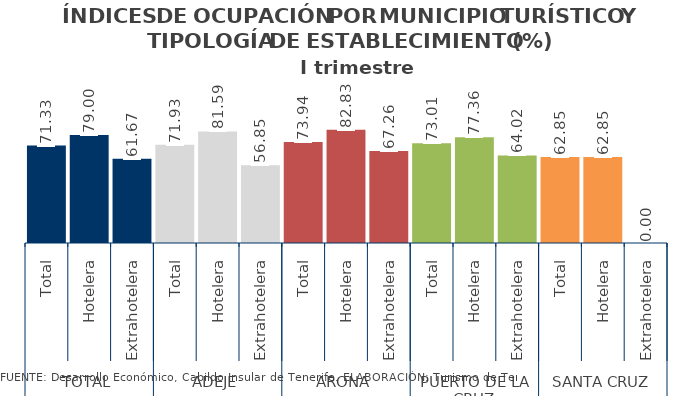
| Category | I trimestre 2014 |
|---|---|
| 0 | 71.334 |
| 1 | 78.997 |
| 2 | 61.675 |
| 3 | 71.926 |
| 4 | 81.586 |
| 5 | 56.847 |
| 6 | 73.938 |
| 7 | 82.826 |
| 8 | 67.257 |
| 9 | 73.01 |
| 10 | 77.362 |
| 11 | 64.025 |
| 12 | 62.852 |
| 13 | 62.852 |
| 14 | 0 |